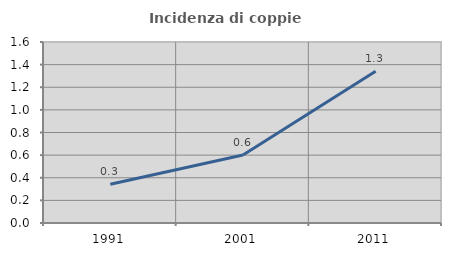
| Category | Incidenza di coppie miste |
|---|---|
| 1991.0 | 0.342 |
| 2001.0 | 0.601 |
| 2011.0 | 1.341 |